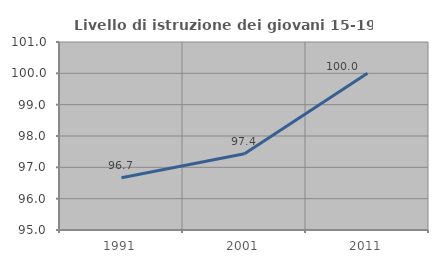
| Category | Livello di istruzione dei giovani 15-19 anni |
|---|---|
| 1991.0 | 96.667 |
| 2001.0 | 97.436 |
| 2011.0 | 100 |